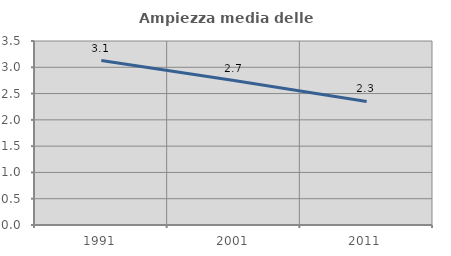
| Category | Ampiezza media delle famiglie |
|---|---|
| 1991.0 | 3.128 |
| 2001.0 | 2.747 |
| 2011.0 | 2.349 |